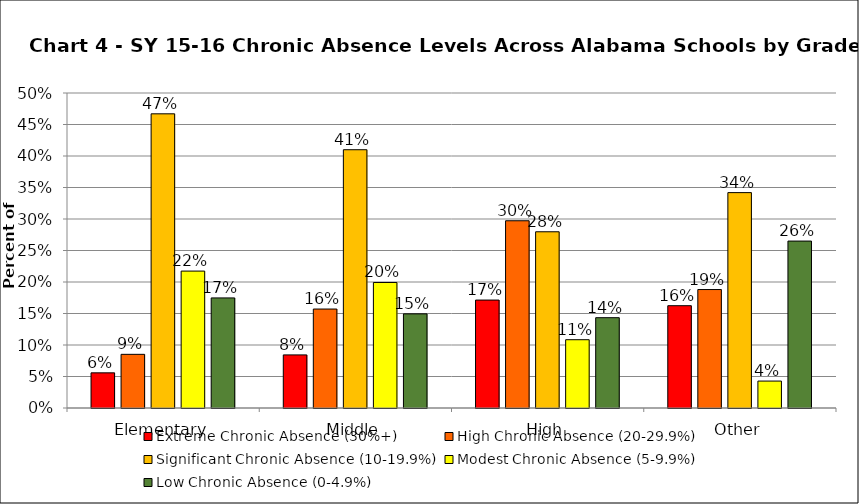
| Category | Extreme Chronic Absence (30%+) | High Chronic Absence (20-29.9%) | Significant Chronic Absence (10-19.9%) | Modest Chronic Absence (5-9.9%) | Low Chronic Absence (0-4.9%) |
|---|---|---|---|---|---|
| 0 | 0.056 | 0.085 | 0.467 | 0.217 | 0.175 |
| 1 | 0.084 | 0.157 | 0.41 | 0.199 | 0.149 |
| 2 | 0.171 | 0.297 | 0.28 | 0.108 | 0.143 |
| 3 | 0.162 | 0.188 | 0.342 | 0.043 | 0.265 |